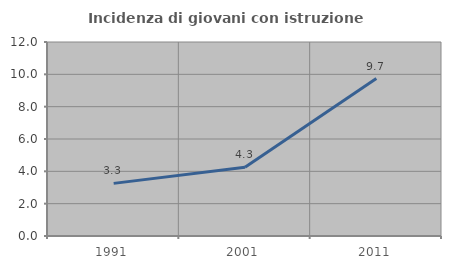
| Category | Incidenza di giovani con istruzione universitaria |
|---|---|
| 1991.0 | 3.256 |
| 2001.0 | 4.255 |
| 2011.0 | 9.74 |